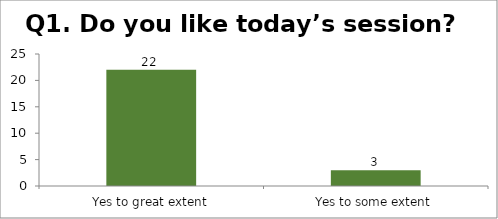
| Category | Q1. Do you like today’s session? |
|---|---|
| Yes to great extent | 22 |
| Yes to some extent | 3 |